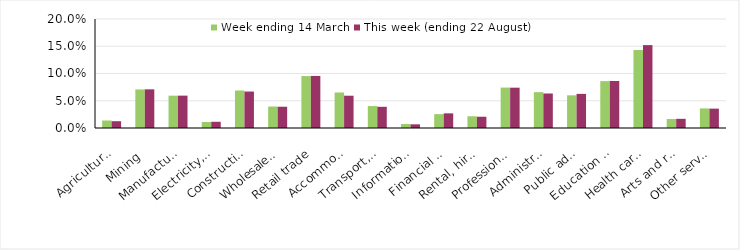
| Category | Week ending 14 March | This week (ending 22 August) |
|---|---|---|
| Agriculture, forestry and fishing | 0.014 | 0.012 |
| Mining | 0.071 | 0.071 |
| Manufacturing | 0.059 | 0.059 |
| Electricity, gas, water and waste services | 0.011 | 0.011 |
| Construction | 0.069 | 0.067 |
| Wholesale trade | 0.039 | 0.039 |
| Retail trade | 0.095 | 0.096 |
| Accommodation and food services | 0.065 | 0.059 |
| Transport, postal and warehousing | 0.04 | 0.039 |
| Information media and telecommunications | 0.007 | 0.007 |
| Financial and insurance services | 0.025 | 0.027 |
| Rental, hiring and real estate services | 0.022 | 0.021 |
| Professional, scientific and technical services | 0.074 | 0.074 |
| Administrative and support services | 0.066 | 0.063 |
| Public administration and safety | 0.06 | 0.063 |
| Education and training | 0.086 | 0.086 |
| Health care and social assistance | 0.143 | 0.152 |
| Arts and recreation services | 0.016 | 0.017 |
| Other services | 0.036 | 0.036 |